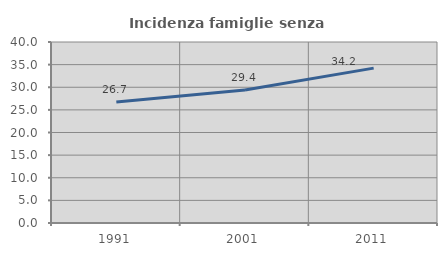
| Category | Incidenza famiglie senza nuclei |
|---|---|
| 1991.0 | 26.739 |
| 2001.0 | 29.407 |
| 2011.0 | 34.223 |